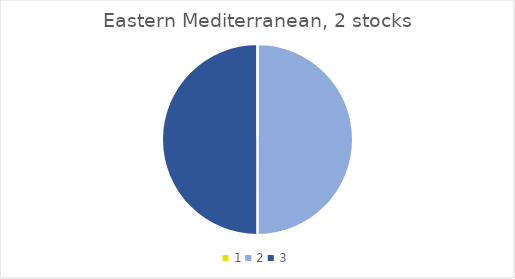
| Category | Eastern Med. |
|---|---|
| 0 | 0 |
| 1 | 1 |
| 2 | 1 |